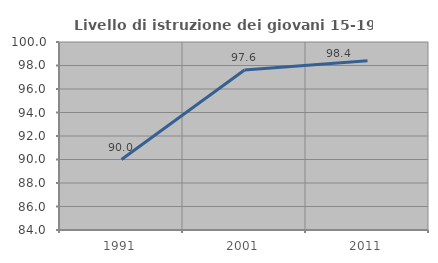
| Category | Livello di istruzione dei giovani 15-19 anni |
|---|---|
| 1991.0 | 90 |
| 2001.0 | 97.619 |
| 2011.0 | 98.413 |